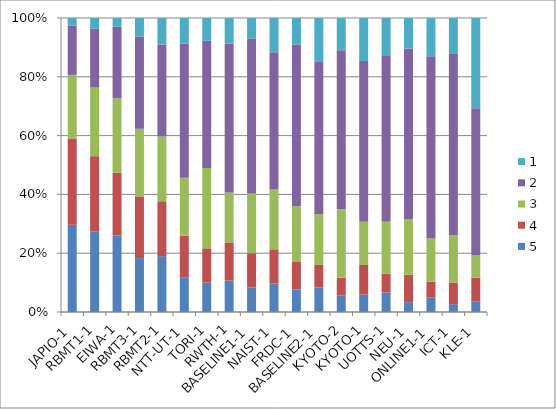
| Category | 5 | 4 | 3 | 2 | 1 |
|---|---|---|---|---|---|
| JAPIO-1 | 89 | 88 | 65 | 50 | 8 |
| RBMT1-1 | 82 | 77 | 70 | 60 | 11 |
| EIWA-1 | 78 | 64 | 76 | 73 | 9 |
| RBMT3-1 | 55 | 63 | 69 | 94 | 19 |
| RBMT2-1 | 57 | 56 | 66 | 94 | 27 |
| NTT-UT-1 | 35 | 43 | 59 | 137 | 26 |
| TORI-1 | 30 | 35 | 82 | 130 | 23 |
| RWTH-1 | 32 | 39 | 51 | 152 | 26 |
| BASELINE1-1 | 25 | 35 | 61 | 158 | 21 |
| NAIST-1 | 29 | 35 | 61 | 140 | 35 |
| FRDC-1 | 23 | 28 | 57 | 165 | 27 |
| BASELINE2-1 | 25 | 23 | 52 | 155 | 45 |
| KYOTO-2 | 17 | 18 | 70 | 162 | 33 |
| KYOTO-1 | 18 | 30 | 44 | 164 | 44 |
| UOTTS-1 | 20 | 19 | 53 | 170 | 38 |
| NEU-1 | 10 | 28 | 57 | 174 | 31 |
| ONLINE1-1 | 15 | 16 | 44 | 186 | 39 |
| ICT-1 | 8 | 22 | 48 | 186 | 36 |
| KLE-1 | 11 | 24 | 23 | 150 | 92 |